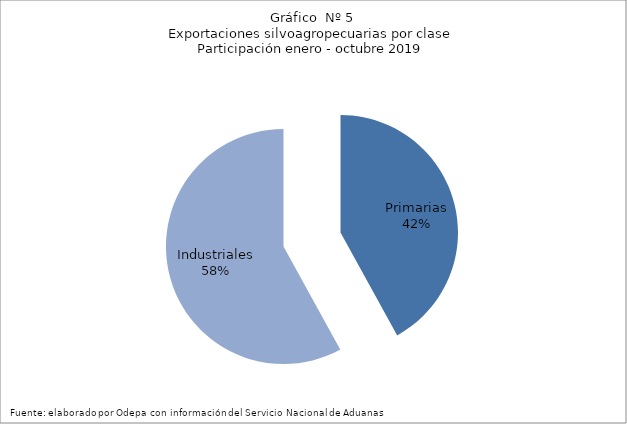
| Category | Series 0 |
|---|---|
| Primarias | 6013469 |
| Industriales | 8311311 |